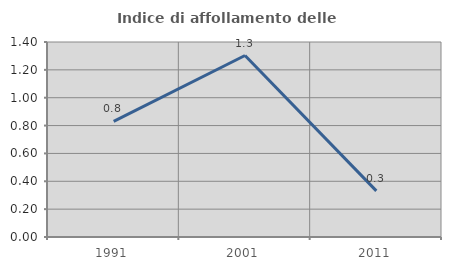
| Category | Indice di affollamento delle abitazioni  |
|---|---|
| 1991.0 | 0.83 |
| 2001.0 | 1.303 |
| 2011.0 | 0.331 |